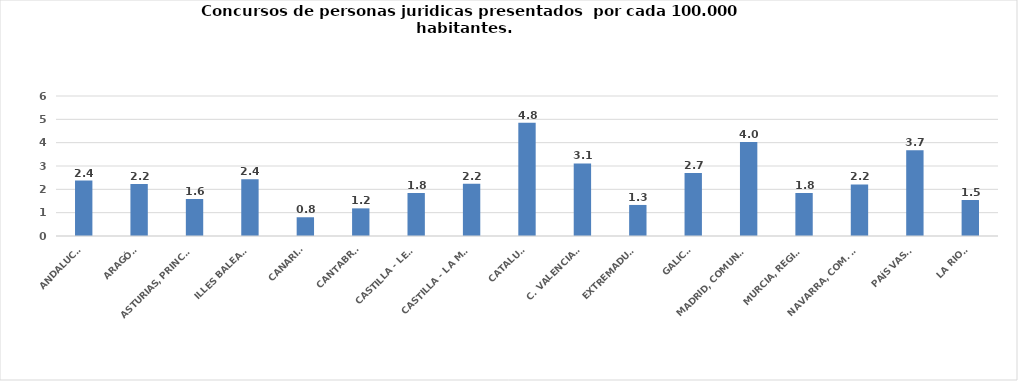
| Category | Series 0 |
|---|---|
| ANDALUCÍA | 2.375 |
| ARAGÓN | 2.227 |
| ASTURIAS, PRINCIPADO | 1.587 |
| ILLES BALEARS | 2.431 |
| CANARIAS | 0.803 |
| CANTABRIA | 1.184 |
| CASTILLA - LEÓN | 1.842 |
| CASTILLA - LA MANCHA | 2.234 |
| CATALUÑA | 4.848 |
| C. VALENCIANA | 3.11 |
| EXTREMADURA | 1.331 |
| GALICIA | 2.698 |
| MADRID, COMUNIDAD | 4.024 |
| MURCIA, REGIÓN | 1.844 |
| NAVARRA, COM. FORAL | 2.209 |
| PAÍS VASCO | 3.677 |
| LA RIOJA | 1.542 |